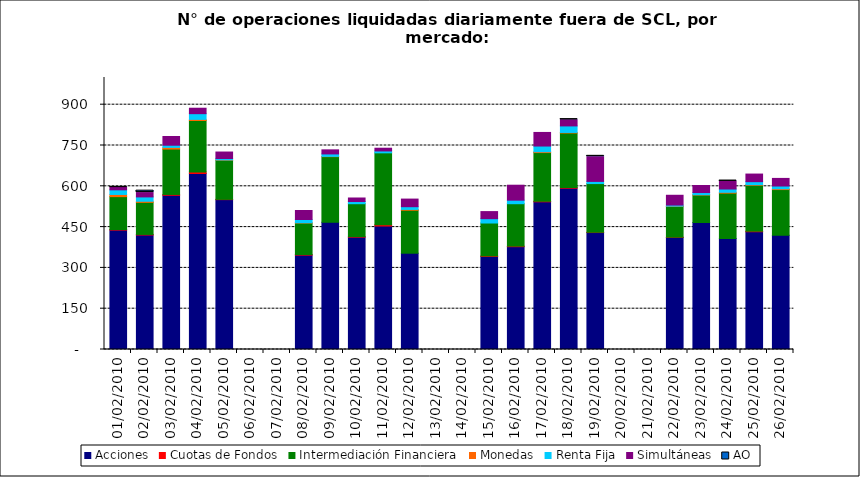
| Category | Acciones | Cuotas de Fondos | Intermediación Financiera | Monedas | Renta Fija | Simultáneas | AO |
|---|---|---|---|---|---|---|---|
| 01/02/2010 | 439 | 2 | 121 | 8 | 17 | 9 | 1 |
| 02/02/2010 | 421 | 2 | 118 | 4 | 16 | 16 | 7 |
| 03/02/2010 | 567 | 3 | 167 | 6 | 8 | 32 | 0 |
| 04/02/2010 | 647 | 6 | 189 | 4 | 21 | 20 | 0 |
| 05/02/2010 | 551 | 1 | 144 | 1 | 5 | 24 | 0 |
| 08/02/2010 | 347 | 2 | 116 | 1 | 12 | 33 | 0 |
| 09/02/2010 | 468 | 0 | 241 | 1 | 9 | 15 | 0 |
| 10/02/2010 | 413 | 2 | 121 | 0 | 8 | 13 | 0 |
| 11/02/2010 | 454 | 5 | 264 | 0 | 7 | 10 | 0 |
| 12/02/2010 | 354 | 0 | 158 | 3 | 10 | 28 | 0 |
| 15/02/2010 | 342 | 2 | 121 | 0 | 16 | 26 | 0 |
| 16/02/2010 | 378 | 2 | 156 | 0 | 13 | 55 | 0 |
| 17/02/2010 | 543 | 2 | 179 | 3 | 21 | 50 | 0 |
| 18/02/2010 | 593 | 3 | 200 | 2 | 24 | 23 | 1 |
| 19/02/2010 | 430 | 1 | 179 | 0 | 8 | 91 | 3 |
| 22/02/2010 | 412 | 1 | 113 | 1 | 4 | 36 | 0 |
| 23/02/2010 | 467 | 0 | 101 | 1 | 8 | 26 | 0 |
| 24/02/2010 | 408 | 0 | 167 | 3 | 12 | 29 | 1 |
| 25/02/2010 | 433 | 2 | 169 | 2 | 11 | 28 | 0 |
| 26/02/2010 | 420 | 0 | 168 | 3 | 10 | 28 | 0 |